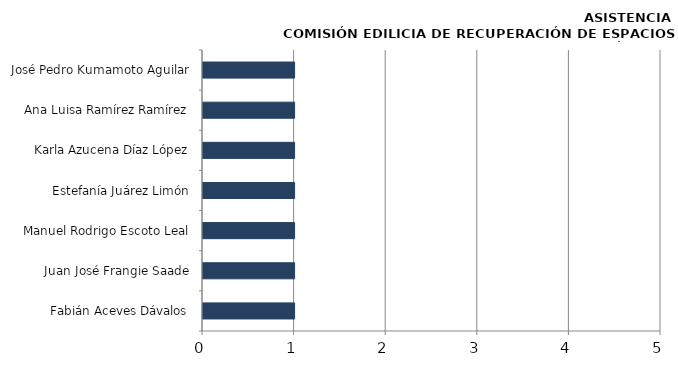
| Category | Series 0 |
|---|---|
| Fabián Aceves Dávalos | 1 |
| Juan José Frangie Saade | 1 |
| Manuel Rodrigo Escoto Leal | 1 |
| Estefanía Juárez Limón | 1 |
| Karla Azucena Díaz López | 1 |
| Ana Luisa Ramírez Ramírez | 1 |
| José Pedro Kumamoto Aguilar | 1 |